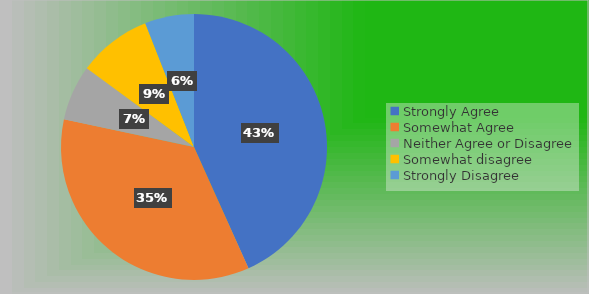
| Category | Series 0 |
|---|---|
| Strongly Agree | 58 |
| Somewhat Agree | 47 |
| Neither Agree or Disagree | 9 |
| Somewhat disagree | 12 |
| Strongly Disagree | 8 |